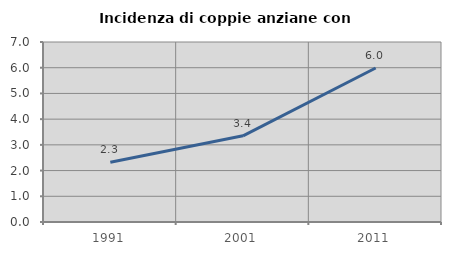
| Category | Incidenza di coppie anziane con figli |
|---|---|
| 1991.0 | 2.326 |
| 2001.0 | 3.352 |
| 2011.0 | 5.988 |